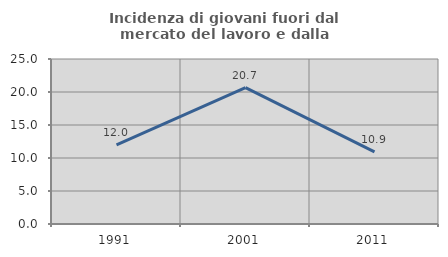
| Category | Incidenza di giovani fuori dal mercato del lavoro e dalla formazione  |
|---|---|
| 1991.0 | 12.004 |
| 2001.0 | 20.661 |
| 2011.0 | 10.935 |